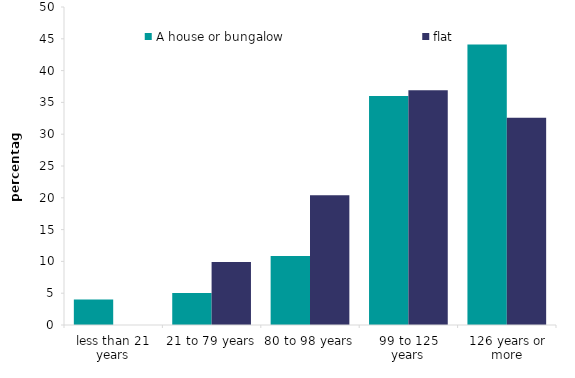
| Category | A house or bungalow | flat |
|---|---|---|
| less than 21 years | 4.002 | 0 |
| 21 to 79 years | 5.044 | 9.897 |
| 80 to 98 years | 10.831 | 20.39 |
| 99 to 125 years | 36.008 | 36.919 |
| 126 years or more | 44.115 | 32.603 |